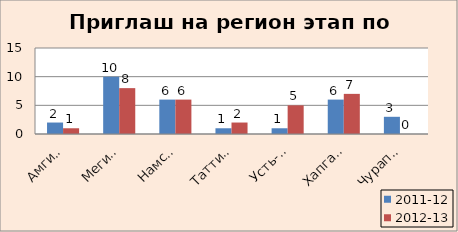
| Category | 2011-12 | 2012-13 |
|---|---|---|
| Амгинский | 2 | 1 |
| Мегино-Кангаласс | 10 | 8 |
| Намский | 6 | 6 |
| Таттинский | 1 | 2 |
| Усть-Алданский | 1 | 5 |
| Хапгаласский | 6 | 7 |
| Чурапчинский | 3 | 0 |